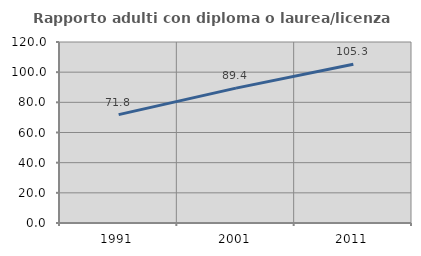
| Category | Rapporto adulti con diploma o laurea/licenza media  |
|---|---|
| 1991.0 | 71.831 |
| 2001.0 | 89.431 |
| 2011.0 | 105.263 |